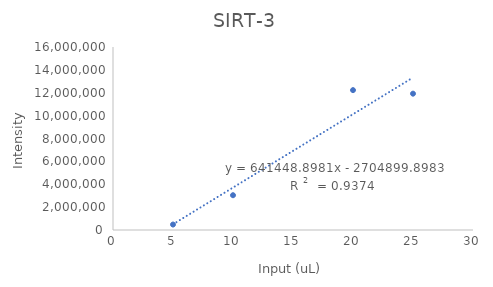
| Category | Series 0 |
|---|---|
| 20.0 | 12228905.189 |
| 5.0 | 477606.623 |
| nan | 13526900.104 |
| nan | 1264125.538 |
| 10.0 | 3040964 |
| 25.0 | 11919858.481 |